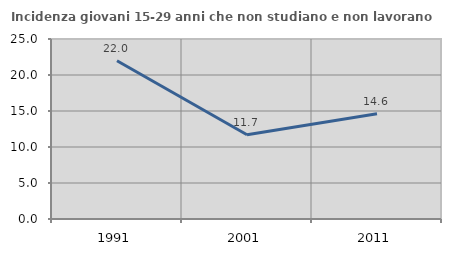
| Category | Incidenza giovani 15-29 anni che non studiano e non lavorano  |
|---|---|
| 1991.0 | 21.974 |
| 2001.0 | 11.699 |
| 2011.0 | 14.631 |